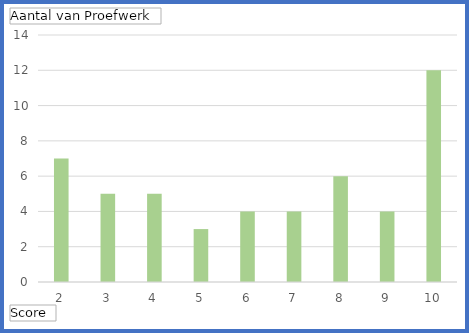
| Category | Totaal |
|---|---|
| 2 | 7 |
| 3 | 5 |
| 4 | 5 |
| 5 | 3 |
| 6 | 4 |
| 7 | 4 |
| 8 | 6 |
| 9 | 4 |
| 10 | 12 |